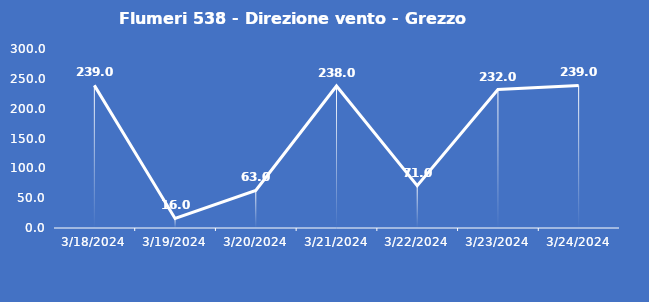
| Category | Flumeri 538 - Direzione vento - Grezzo (°N) |
|---|---|
| 3/18/24 | 239 |
| 3/19/24 | 16 |
| 3/20/24 | 63 |
| 3/21/24 | 238 |
| 3/22/24 | 71 |
| 3/23/24 | 232 |
| 3/24/24 | 239 |